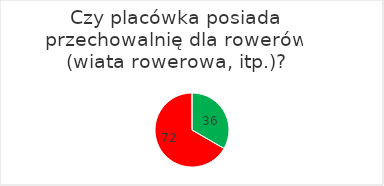
| Category | Series 0 |
|---|---|
| 0 | 36 |
| 1 | 72 |